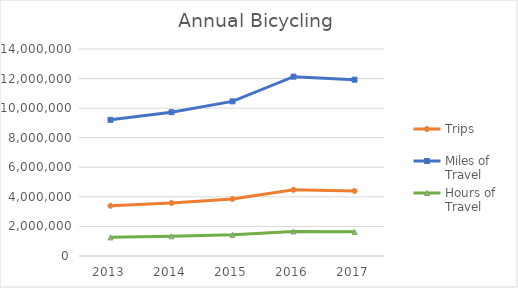
| Category | Trips | Miles of Travel | Hours of Travel |
|---|---|---|---|
| 2013 | 3397591.94 | 9209172.952 | 1261023.61 |
| 2014 | 3588744.42 | 9727291.751 | 1331970.267 |
| 2015 | 3858575.157 | 10458667.962 | 1432118.53 |
| 2016 | 4475089.311 | 12129729.577 | 1660939.094 |
| 2017 | 4399437.925 | 11924676.495 | 1632860.918 |